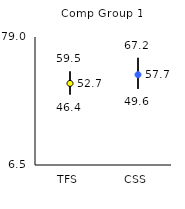
| Category | 25th | 75th | Mean |
|---|---|---|---|
| TFS | 46.4 | 59.5 | 52.7 |
| CSS | 49.6 | 67.2 | 57.67 |